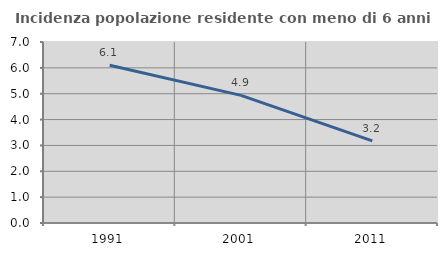
| Category | Incidenza popolazione residente con meno di 6 anni |
|---|---|
| 1991.0 | 6.1 |
| 2001.0 | 4.935 |
| 2011.0 | 3.173 |